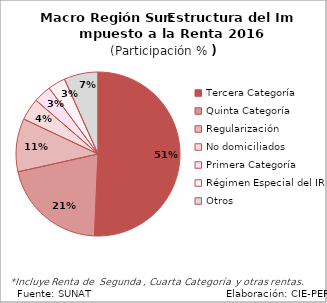
| Category | Series 0 |
|---|---|
| Tercera Categoría | 854.083 |
| Quinta Categoría | 351.063 |
| Regularización | 176.851 |
| No domiciliados | 73.629 |
| Primera Categoría | 58.76 |
| Régimen Especial del IR | 58.136 |
| Otros | 112.933 |